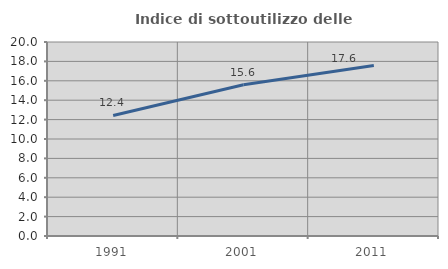
| Category | Indice di sottoutilizzo delle abitazioni  |
|---|---|
| 1991.0 | 12.429 |
| 2001.0 | 15.584 |
| 2011.0 | 17.578 |